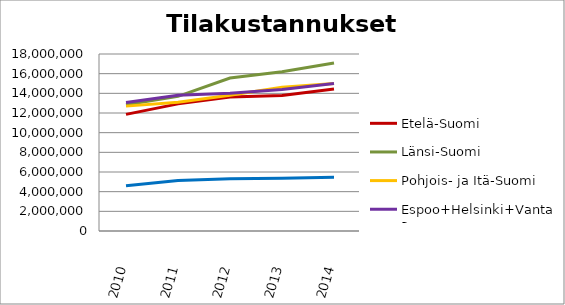
| Category | Etelä-Suomi | Länsi-Suomi | Pohjois- ja Itä-Suomi | Espoo+Helsinki+Vantaa | Muu Uusimaa |
|---|---|---|---|---|---|
| 2010.0 | 11860096.43 | 12841055.53 | 12699208.9 | 13058277 | 4607420.74 |
| 2011.0 | 12928410.21 | 13695878.72 | 13101838.33 | 13793740.99 | 5135948.72 |
| 2012.0 | 13624823.41 | 15559664.06 | 13802716.53 | 14012919.26 | 5325008.08 |
| 2013.0 | 13784368.42 | 16185299.56 | 14609058.61 | 14391460.6 | 5357988 |
| 2014.0 | 14449433.84 | 17091620.9 | 15010277.79 | 14996450.7 | 5466987.71 |